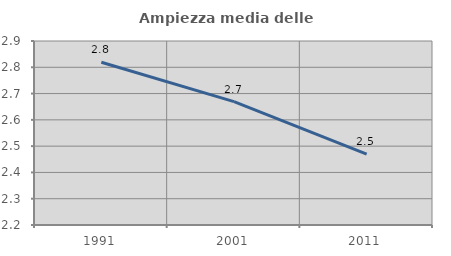
| Category | Ampiezza media delle famiglie |
|---|---|
| 1991.0 | 2.819 |
| 2001.0 | 2.669 |
| 2011.0 | 2.47 |